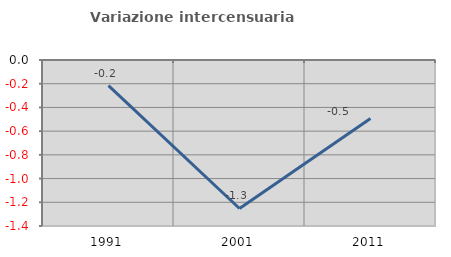
| Category | Variazione intercensuaria annua |
|---|---|
| 1991.0 | -0.216 |
| 2001.0 | -1.252 |
| 2011.0 | -0.493 |